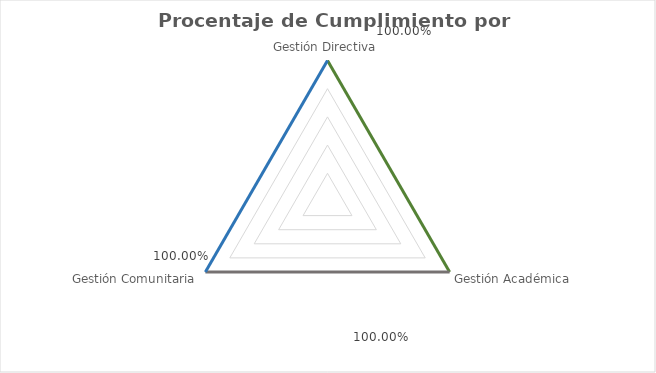
| Category | Series 0 |
|---|---|
| Gestión Directiva | 1 |
| Gestión Académica | 1 |
| Gestión Comunitaria | 1 |